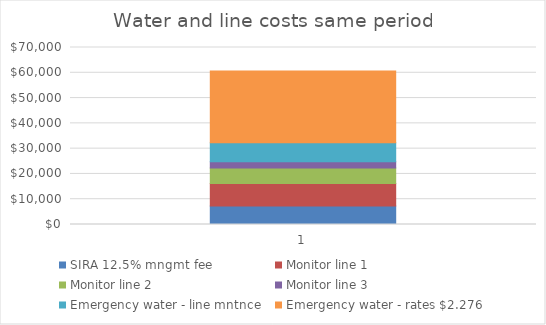
| Category | SIRA 12.5% mngmt fee | Monitor line 1 | Monitor line 2 | Monitor line 3 | Emergency water - line mntnce | Emergency water - rates $2.276 |
|---|---|---|---|---|---|---|
| 0 | 7311 | 8883.99 | 6194.07 | 2423.53 | 7564.63 | 28330.88 |